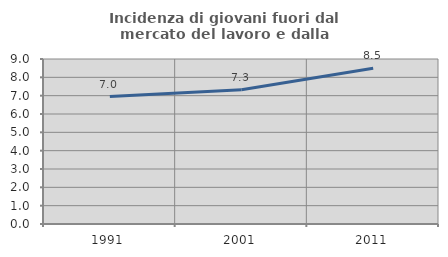
| Category | Incidenza di giovani fuori dal mercato del lavoro e dalla formazione  |
|---|---|
| 1991.0 | 6.952 |
| 2001.0 | 7.323 |
| 2011.0 | 8.499 |